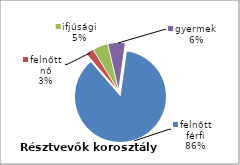
| Category | Series 0 |
|---|---|
| felnőtt férfi | 134 |
| felnőtt nő | 4 |
| ifjúsági | 8 |
| gyermek | 9 |